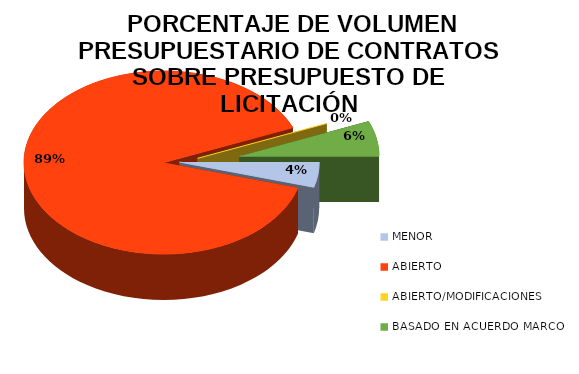
| Category |  PORCENTAJE DE VOLUMEN PRESUPUESTARIO DE CONTRATOS A TRAVÉS DE LOS PROCEDIMIENTOS DE ADJUDICACIÓN |
|---|---|
| MENOR | 0.044 |
| ABIERTO | 0.893 |
| ABIERTO/MODIFICACIONES | 0 |
| BASADO EN ACUERDO MARCO | 0.062 |